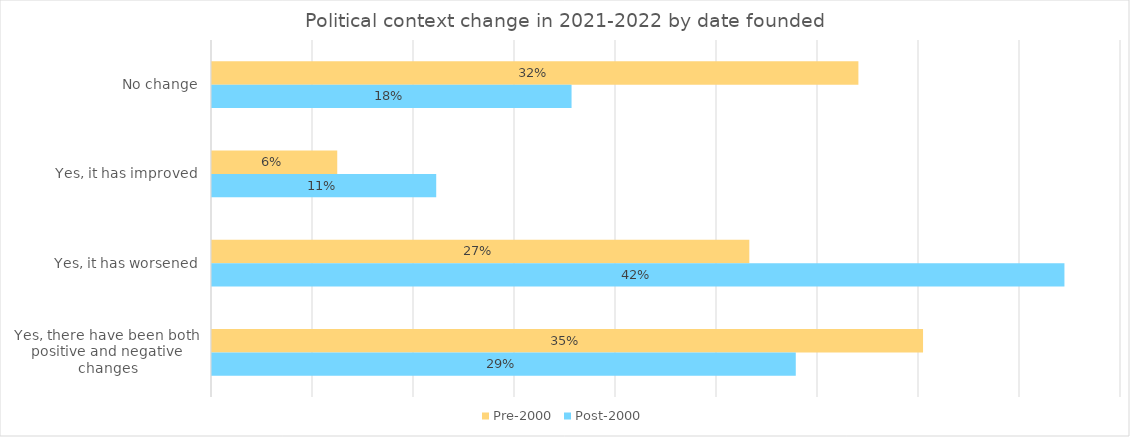
| Category | Pre-2000 | Post-2000 |
|---|---|---|
| No change | 32 | 17.8 |
| Yes, it has improved | 6.2 | 11.1 |
| Yes, it has worsened | 26.6 | 42.2 |
| Yes, there have been both positive and negative changes | 35.2 | 28.9 |